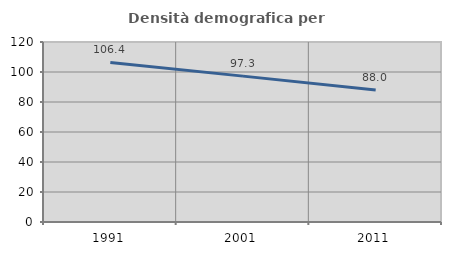
| Category | Densità demografica |
|---|---|
| 1991.0 | 106.407 |
| 2001.0 | 97.252 |
| 2011.0 | 87.968 |